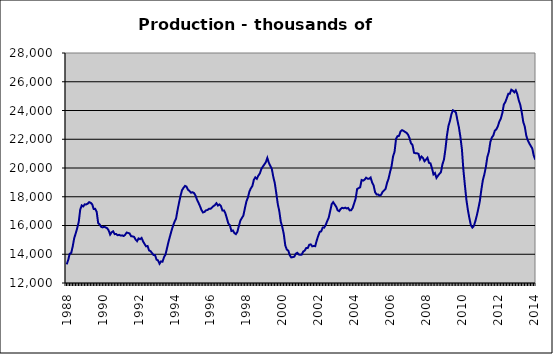
| Category | Series 0 |
|---|---|
| 1988.0 | 13298 |
| nan | 13613 |
| nan | 14036 |
| nan | 14095 |
| nan | 14552 |
| nan | 15129 |
| nan | 15453 |
| nan | 15821 |
| nan | 16239 |
| nan | 17103 |
| nan | 17396 |
| nan | 17325 |
| 1989.0 | 17470 |
| nan | 17468 |
| nan | 17520 |
| nan | 17623 |
| nan | 17580 |
| nan | 17470 |
| nan | 17146 |
| nan | 17161 |
| nan | 16951 |
| nan | 16166 |
| nan | 16071 |
| nan | 15906 |
| 1990.0 | 15869 |
| nan | 15914 |
| nan | 15868 |
| nan | 15812 |
| nan | 15656 |
| nan | 15368 |
| nan | 15531 |
| nan | 15596 |
| nan | 15400 |
| nan | 15410 |
| nan | 15322 |
| nan | 15353 |
| 1991.0 | 15299 |
| nan | 15313 |
| nan | 15269 |
| nan | 15352 |
| nan | 15508 |
| nan | 15484 |
| nan | 15445 |
| nan | 15255 |
| nan | 15241 |
| nan | 15209 |
| nan | 15023 |
| nan | 14910 |
| 1992.0 | 15103 |
| nan | 15050 |
| nan | 15135 |
| nan | 14888 |
| nan | 14713 |
| nan | 14549 |
| nan | 14574 |
| nan | 14269 |
| nan | 14214 |
| nan | 14079 |
| nan | 13946 |
| nan | 13943 |
| 1993.0 | 13620 |
| nan | 13569 |
| nan | 13340 |
| nan | 13504 |
| nan | 13481 |
| nan | 13797 |
| nan | 13989 |
| nan | 14432 |
| nan | 14873 |
| nan | 15260 |
| nan | 15641 |
| nan | 15980 |
| 1994.0 | 16256 |
| nan | 16466 |
| nan | 17054 |
| nan | 17574 |
| nan | 18062 |
| nan | 18451 |
| nan | 18618 |
| nan | 18754 |
| nan | 18702 |
| nan | 18488 |
| nan | 18404 |
| nan | 18280 |
| 1995.0 | 18315 |
| nan | 18263 |
| nan | 18087 |
| nan | 17804 |
| nan | 17586 |
| nan | 17349 |
| nan | 17082 |
| nan | 16908 |
| nan | 16945 |
| nan | 17055 |
| nan | 17076 |
| nan | 17157 |
| 1996.0 | 17157 |
| nan | 17246 |
| nan | 17345 |
| nan | 17421 |
| nan | 17552 |
| nan | 17389 |
| nan | 17467 |
| nan | 17359 |
| nan | 17039 |
| nan | 17049 |
| nan | 16842 |
| nan | 16490 |
| 1997.0 | 16125 |
| nan | 16022 |
| nan | 15618 |
| nan | 15657 |
| nan | 15473 |
| nan | 15399 |
| nan | 15558 |
| nan | 15966 |
| nan | 16344 |
| nan | 16521 |
| nan | 16693 |
| nan | 17188 |
| 1998.0 | 17666 |
| nan | 17940 |
| nan | 18356 |
| nan | 18585 |
| nan | 18742 |
| nan | 19179 |
| nan | 19354 |
| nan | 19252 |
| nan | 19468 |
| nan | 19619 |
| nan | 19925 |
| nan | 20099 |
| 1999.0 | 20243 |
| nan | 20402 |
| nan | 20700 |
| nan | 20367 |
| nan | 20147 |
| nan | 19940 |
| nan | 19377 |
| nan | 18941 |
| nan | 18238 |
| nan | 17487 |
| nan | 16998 |
| nan | 16256 |
| 2000.0 | 15900 |
| nan | 15406 |
| nan | 14611 |
| nan | 14329 |
| nan | 14253 |
| nan | 13932 |
| nan | 13779 |
| nan | 13801.4 |
| nan | 13830.4 |
| nan | 14037.4 |
| nan | 14101.4 |
| nan | 13983.1 |
| 2001.0 | 13960.1 |
| nan | 13974.1 |
| nan | 14189.1 |
| nan | 14260.1 |
| nan | 14432.1 |
| nan | 14427.1 |
| nan | 14658.1 |
| nan | 14686.7 |
| nan | 14553.7 |
| nan | 14574.7 |
| nan | 14561.7 |
| nan | 14957 |
| 2002.0 | 15275 |
| nan | 15557 |
| nan | 15595 |
| nan | 15856 |
| nan | 15851.599 |
| nan | 16039.659 |
| nan | 16305.273 |
| nan | 16538.099 |
| nan | 17002.492 |
| nan | 17480.564 |
| nan | 17624.181 |
| nan | 17467.591 |
| 2003.0 | 17309.332 |
| nan | 17053.665 |
| nan | 16997.03 |
| nan | 17151.655 |
| nan | 17232.406 |
| nan | 17196.823 |
| nan | 17241.683 |
| nan | 17181.379 |
| nan | 17220.897 |
| nan | 17052.724 |
| nan | 17061.407 |
| nan | 17213.928 |
| 2004.0 | 17541.226 |
| nan | 17867.995 |
| nan | 18539.895 |
| nan | 18598.329 |
| nan | 18656.076 |
| nan | 19166.251 |
| nan | 19120.661 |
| nan | 19189.733 |
| nan | 19328.127 |
| nan | 19258.289 |
| nan | 19252.511 |
| nan | 19338.37 |
| 2005.0 | 18996.26 |
| nan | 18796.585 |
| nan | 18320.167 |
| nan | 18157.703 |
| nan | 18162.296 |
| nan | 18079.378 |
| nan | 18137.193 |
| nan | 18341.12 |
| nan | 18433.673 |
| nan | 18552.613 |
| nan | 18965.757 |
| nan | 19260.619 |
| 2006.0 | 19721.48 |
| nan | 20125.464 |
| nan | 20802.737 |
| nan | 21126.107 |
| nan | 22029.619 |
| nan | 22217.811 |
| nan | 22237.362 |
| nan | 22547.07 |
| nan | 22632.333 |
| nan | 22582.778 |
| nan | 22510.289 |
| nan | 22448.548 |
| 2007.0 | 22323.973 |
| nan | 22075.929 |
| nan | 21715.697 |
| nan | 21604.441 |
| nan | 21062.597 |
| nan | 21023.355 |
| nan | 21024.846 |
| nan | 20981.485 |
| nan | 20607.715 |
| nan | 20797.229 |
| nan | 20694.61 |
| nan | 20471.092 |
| 2008.0 | 20585.2 |
| nan | 20710.561 |
| nan | 20358.458 |
| nan | 20325.647 |
| nan | 19979.543 |
| nan | 19554.517 |
| nan | 19651.268 |
| nan | 19311.858 |
| nan | 19461.289 |
| nan | 19595.012 |
| nan | 19713.509 |
| nan | 20258.46 |
| 2009.0 | 20578.483 |
| nan | 21319.355 |
| nan | 22259.016 |
| nan | 22920.613 |
| nan | 23274.392 |
| nan | 23748.382 |
| nan | 24015.968 |
| nan | 23949.497 |
| nan | 23863.422 |
| nan | 23322.324 |
| nan | 22828.491 |
| nan | 22156.289 |
| 2010.0 | 21300.696 |
| nan | 19860.435 |
| nan | 18798.577 |
| nan | 17788.895 |
| nan | 17077.542 |
| nan | 16503.382 |
| nan | 16020.404 |
| nan | 15856.582 |
| nan | 15970.325 |
| nan | 16313.459 |
| nan | 16710.849 |
| nan | 17190.1 |
| 2011.0 | 17714.519 |
| nan | 18495.045 |
| nan | 19156.284 |
| nan | 19557.491 |
| nan | 20077.898 |
| nan | 20765.665 |
| nan | 21128.425 |
| nan | 21807.194 |
| nan | 22118.818 |
| nan | 22265.055 |
| nan | 22598.415 |
| nan | 22689.418 |
| 2012.0 | 22897.671 |
| nan | 23231.411 |
| nan | 23440.859 |
| nan | 23818.515 |
| nan | 24413.871 |
| nan | 24588.394 |
| nan | 24861.032 |
| nan | 25161.729 |
| nan | 25167.17 |
| nan | 25447.846 |
| nan | 25381.393 |
| nan | 25264.451 |
| 2013.0 | 25405.25 |
| nan | 25140.11 |
| nan | 24700.704 |
| nan | 24392.196 |
| nan | 23867.507 |
| nan | 23197.845 |
| nan | 22875.331 |
| nan | 22255.465 |
| nan | 21921.342 |
| nan | 21717.58 |
| nan | 21535.364 |
| nan | 21359.765 |
| 2014.0 | 20861.327 |
| nan | 20587.907 |